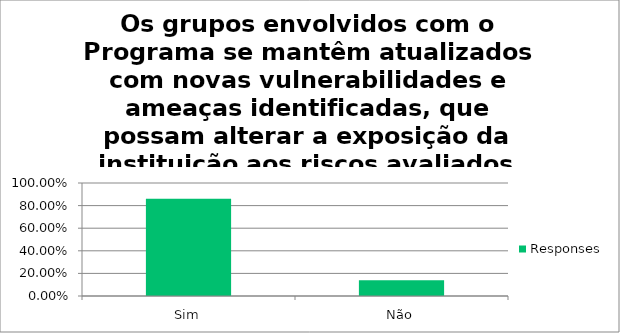
| Category | Responses |
|---|---|
| Sim | 0.86 |
| Não | 0.14 |